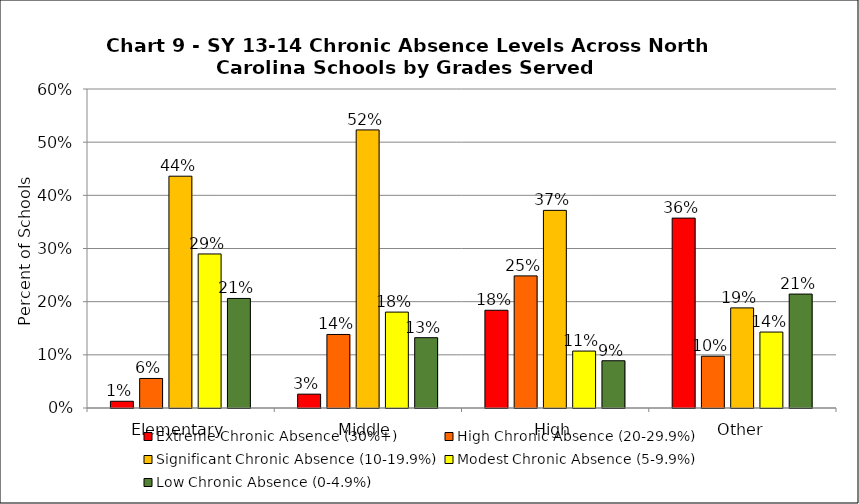
| Category | Extreme Chronic Absence (30%+) | High Chronic Absence (20-29.9%) | Significant Chronic Absence (10-19.9%) | Modest Chronic Absence (5-9.9%) | Low Chronic Absence (0-4.9%) |
|---|---|---|---|---|---|
| 0 | 0.013 | 0.056 | 0.436 | 0.29 | 0.206 |
| 1 | 0.026 | 0.138 | 0.523 | 0.18 | 0.132 |
| 2 | 0.184 | 0.248 | 0.372 | 0.107 | 0.089 |
| 3 | 0.357 | 0.097 | 0.188 | 0.143 | 0.214 |